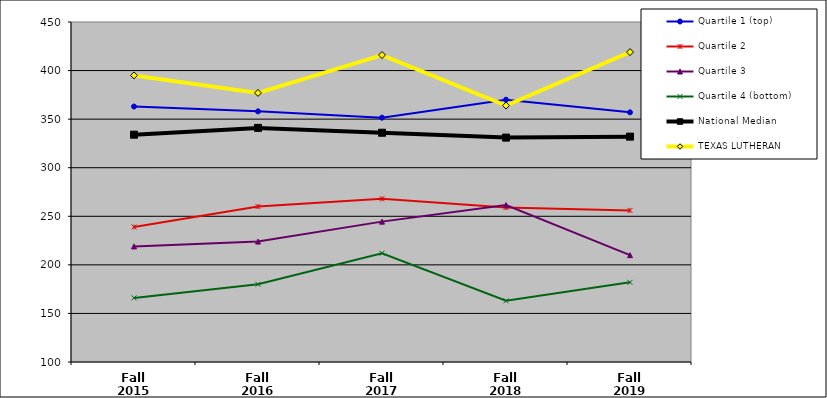
| Category | Quartile 1 (top) | Quartile 2 | Quartile 3 | Quartile 4 (bottom) | National Median | TEXAS LUTHERAN |
|---|---|---|---|---|---|---|
| Fall 2015 | 363 | 239 | 219 | 166 | 334 | 395 |
| Fall 2016 | 358 | 260 | 224 | 180 | 341 | 377 |
| Fall 2017 | 351.5 | 268 | 244.5 | 212 | 336 | 416 |
| Fall 2018 | 370 | 259 | 261.5 | 163 | 331 | 364 |
| Fall 2019 | 357 | 256 | 210 | 182 | 332 | 419 |